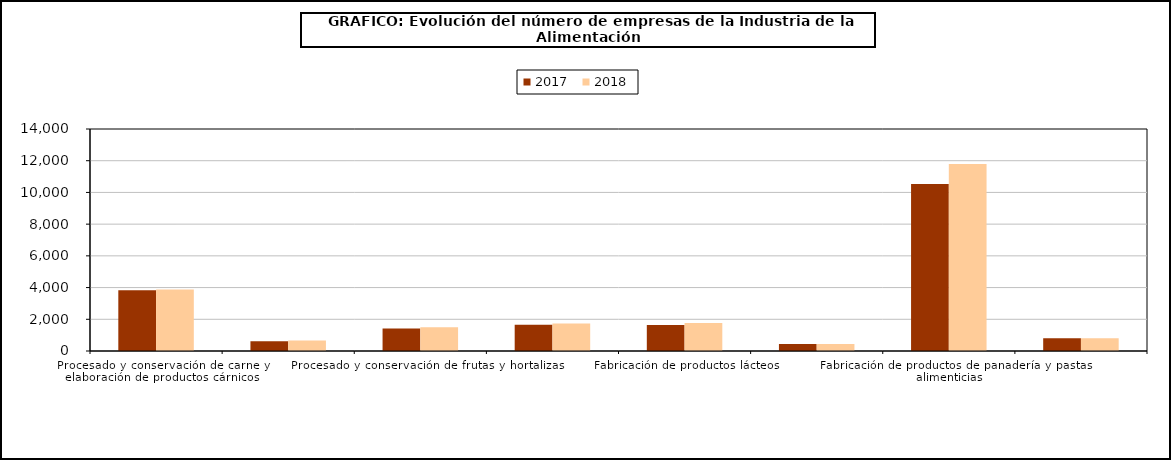
| Category | 2017 | 2018 |
|---|---|---|
| Procesado y conservación de carne y elaboración de productos cárnicos | 3830 | 3882 |
| Procesado y conservación de pescados, crustáceos y moluscos | 622 | 659 |
| Procesado y conservación de frutas y hortalizas | 1423 | 1500 |
| Fabricación de aceites y grasas vegetales y animales | 1655 | 1727 |
| Fabricación de productos lácteos | 1641 | 1769 |
| Fabricación de productos de molinería, almidones y productos amiláceos | 438 | 439 |
| Fabricación de productos de panadería y pastas alimenticias | 10539 | 11788 |
| Fabricación de productos para la alimentación animal | 798 | 804 |